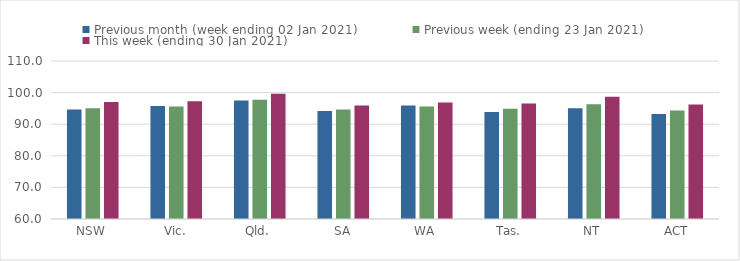
| Category | Previous month (week ending 02 Jan 2021) | Previous week (ending 23 Jan 2021) | This week (ending 30 Jan 2021) |
|---|---|---|---|
| NSW | 94.66 | 95.01 | 97.04 |
| Vic. | 95.73 | 95.59 | 97.28 |
| Qld. | 97.49 | 97.74 | 99.64 |
| SA | 94.19 | 94.67 | 95.92 |
| WA | 95.92 | 95.57 | 96.84 |
| Tas. | 93.84 | 94.92 | 96.52 |
| NT | 95.03 | 96.28 | 98.66 |
| ACT | 93.24 | 94.31 | 96.24 |